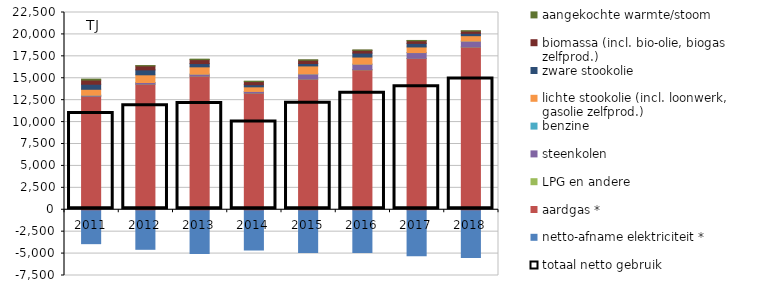
| Category | netto-afname elektriciteit * | aardgas * | LPG en andere | steenkolen | benzine | lichte stookolie (incl. loonwerk, gasolie zelfprod.) | zware stookolie | biomassa (incl. bio-olie, biogas zelfprod.) | aangekochte warmte/stoom |
|---|---|---|---|---|---|---|---|---|---|
| 2011.0 | -3868.464 | 12945.659 | 4.486 | 113.553 | 0.87 | 676.408 | 575.217 | 476.911 | 106.932 |
| 2012.0 | -4511.761 | 14333.023 | 5.275 | 173.925 | 1.188 | 878.266 | 562.024 | 458.232 | 27.959 |
| 2013.0 | -5003.12 | 15248.434 | 6.865 | 204.737 | 1.899 | 838.638 | 371.042 | 451.57 | 55.005 |
| 2014.0 | -4592.45 | 13309.719 | 7.104 | 177.236 | 2.237 | 524.053 | 243.437 | 355.812 | 44.612 |
| 2015.0 | -4889.631 | 14905.206 | 6.074 | 578.892 | 2.613 | 912.338 | 277.565 | 371.846 | 46.472 |
| 2016.0 | -4866.512 | 15964.576 | 8.303 | 628.32 | 3.184 | 815.399 | 451.608 | 315.931 | 38.363 |
| 2017.0 | -5235.047 | 17257.976 | 14.004 | 655.409 | 2.75 | 640.022 | 405.13 | 303.41 | 32.944 |
| 2018.0 | -5439.371 | 18561.238 | 8.437 | 661.023 | 4.837 | 619.773 | 268.194 | 254.053 | 37.836 |